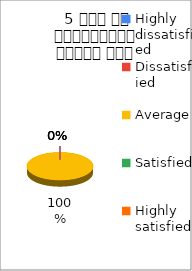
| Category | 5 समय पर पाठ्यक्रम  पूर्ण हुआ  |
|---|---|
| Highly dissatisfied | 0 |
| Dissatisfied | 0 |
| Average | 1 |
| Satisfied | 0 |
| Highly satisfied | 0 |